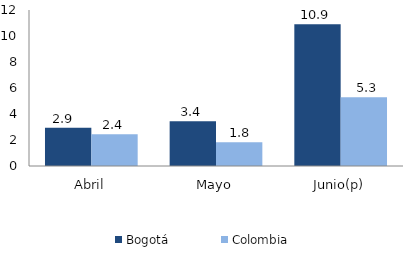
| Category | Bogotá | Colombia |
|---|---|---|
| Abril | 2.949 | 2.449 |
| Mayo | 3.446 | 1.821 |
| Junio(p) | 10.901 | 5.29 |